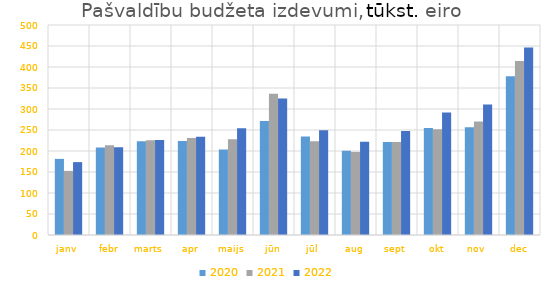
| Category | 2020 | 2021 | 2022 |
|---|---|---|---|
| janv | 181241.02 | 152675.552 | 173548.423 |
| febr | 208405.475 | 213940.448 | 208650.357 |
| marts | 223138.505 | 225624.876 | 226166.321 |
| apr | 223577 | 231146.925 | 234145.666 |
| maijs | 203504.23 | 228193.448 | 253995.943 |
| jūn | 271297.77 | 336561.936 | 325201.018 |
| jūl | 234617.887 | 223275.425 | 249623.438 |
| aug | 200617.365 | 197904.39 | 221979.814 |
| sept | 221574.112 | 221712.162 | 247335.901 |
| okt | 254993.621 | 251718.671 | 291387.208 |
| nov | 256741.926 | 270071.167 | 310697.322 |
| dec | 378007.978 | 414250.751 | 446706.592 |